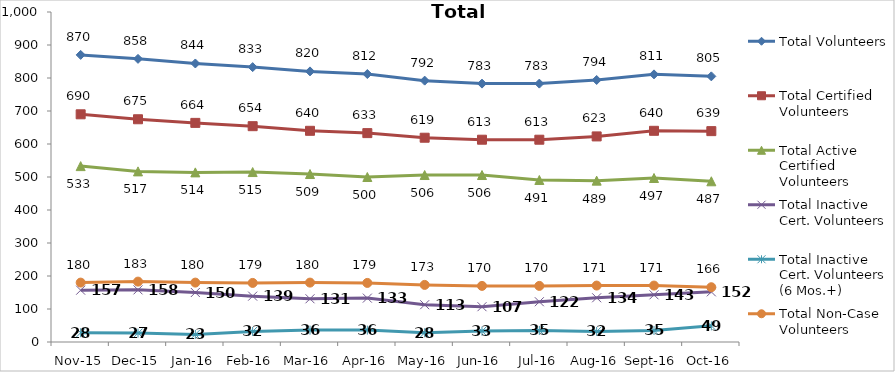
| Category | Total Volunteers | Total Certified Volunteers | Total Active Certified Volunteers | Total Inactive Cert. Volunteers | Total Inactive Cert. Volunteers (6 Mos.+) | Total Non-Case Volunteers |
|---|---|---|---|---|---|---|
| Nov-15 | 870 | 690 | 533 | 157 | 28 | 180 |
| Dec-15 | 858 | 675 | 517 | 158 | 27 | 183 |
| Jan-16 | 844 | 664 | 514 | 150 | 23 | 180 |
| Feb-16 | 833 | 654 | 515 | 139 | 32 | 179 |
| Mar-16 | 820 | 640 | 509 | 131 | 36 | 180 |
| Apr-16 | 812 | 633 | 500 | 133 | 36 | 179 |
| May-16 | 792 | 619 | 506 | 113 | 28 | 173 |
| Jun-16 | 783 | 613 | 506 | 107 | 33 | 170 |
| Jul-16 | 783 | 613 | 491 | 122 | 35 | 170 |
| Aug-16 | 794 | 623 | 489 | 134 | 32 | 171 |
| Sep-16 | 811 | 640 | 497 | 143 | 35 | 171 |
| Oct-16 | 805 | 639 | 487 | 152 | 49 | 166 |